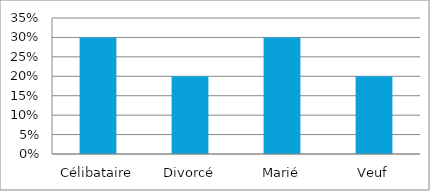
| Category | Pourcentage
% |
|---|---|
| Célibataire | 0.3 |
| Divorcé | 0.2 |
| Marié | 0.3 |
| Veuf | 0.2 |